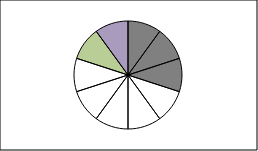
| Category | Series 0 |
|---|---|
| 0 | 1 |
| 1 | 1 |
| 2 | 1 |
| 3 | 1 |
| 4 | 1 |
| 5 | 1 |
| 6 | 1 |
| 7 | 1 |
| 8 | 1 |
| 9 | 1 |